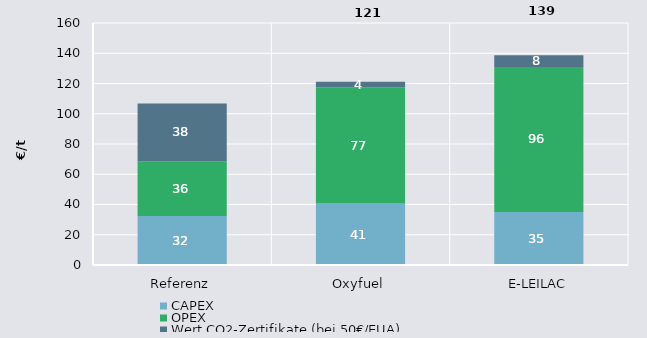
| Category | CAPEX | OPEX | Wert CO2-Zertifikate (bei 50€/EUA) | Gutschrift CO2-Senkenzertifikate (bei 0€/EUA) |
|---|---|---|---|---|
| Referenz | 32.34 | 36.248 | 38.26 | 0 |
| Oxyfuel | 40.6 | 76.748 | 3.826 | 0 |
| E-LEILAC | 35.07 | 95.812 | 7.736 | 0 |